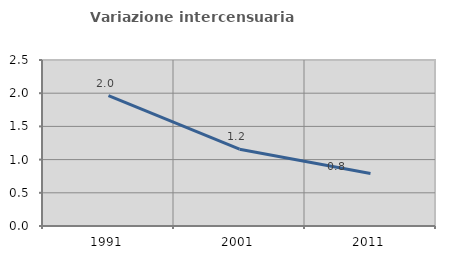
| Category | Variazione intercensuaria annua |
|---|---|
| 1991.0 | 1.963 |
| 2001.0 | 1.156 |
| 2011.0 | 0.791 |